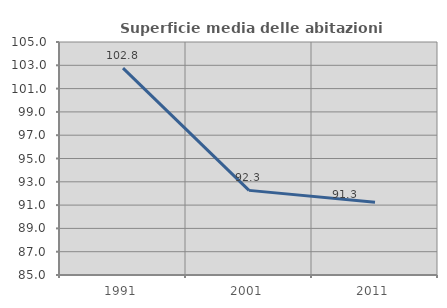
| Category | Superficie media delle abitazioni occupate |
|---|---|
| 1991.0 | 102.754 |
| 2001.0 | 92.264 |
| 2011.0 | 91.251 |